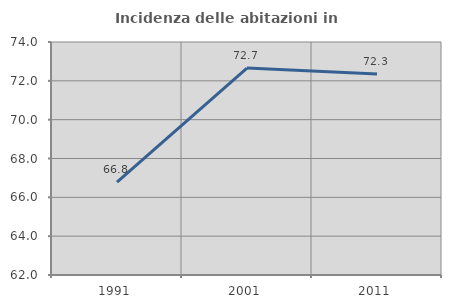
| Category | Incidenza delle abitazioni in proprietà  |
|---|---|
| 1991.0 | 66.786 |
| 2001.0 | 72.659 |
| 2011.0 | 72.347 |